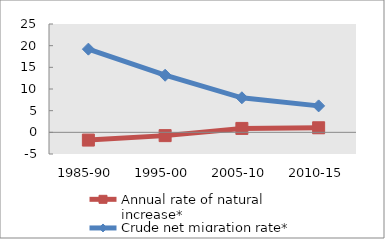
| Category | Annual rate of natural increase* | Crude net migration rate* |
|---|---|---|
| 1985-90 | -1.787 | 19.199 |
| 1995-00 | -0.76 | 13.177 |
| 2005-10 | 0.903 | 7.974 |
| 2010-15 | 1.053 | 6.104 |